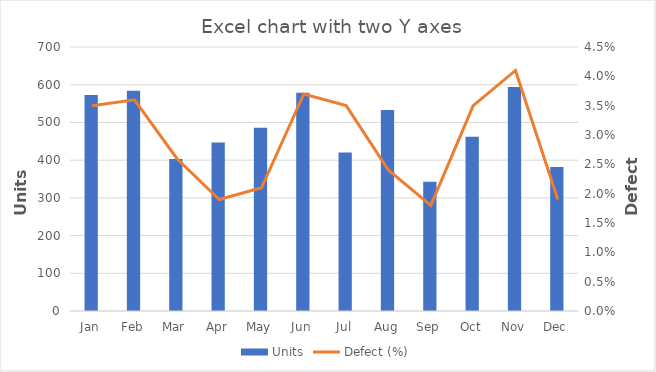
| Category | Units |
|---|---|
| Jan | 573 |
| Feb | 584 |
| Mar | 403 |
| Apr | 447 |
| May | 486 |
| Jun | 579 |
| Jul | 420 |
| Aug | 533 |
| Sep | 343 |
| Oct | 462 |
| Nov | 594 |
| Dec | 382 |